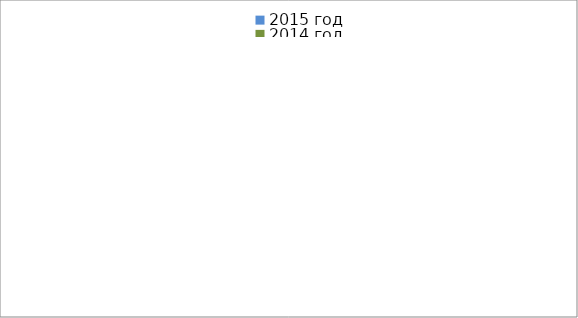
| Category | 2015 год | 2014 год |
|---|---|---|
|  - поджог | 2 | 4 |
|  - неосторожное обращение с огнём | 26 | 16 |
|  - НПТЭ электрооборудования | 7 | 10 |
|  - НПУ и Э печей | 27 | 33 |
|  - НПУ и Э транспортных средств | 32 | 34 |
|   -Шалость с огнем детей | 1 | 0 |
|  -НППБ при эксплуатации эл.приборов | 10 | 12 |
|  - курение | 9 | 9 |
| - прочие | 39 | 51 |
| - не установленные причины | 3 | 7 |